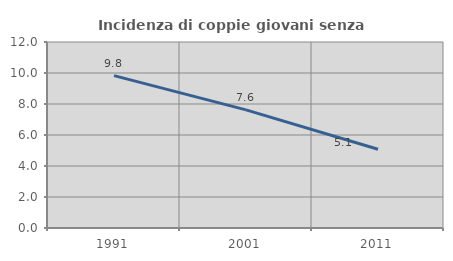
| Category | Incidenza di coppie giovani senza figli |
|---|---|
| 1991.0 | 9.83 |
| 2001.0 | 7.62 |
| 2011.0 | 5.08 |